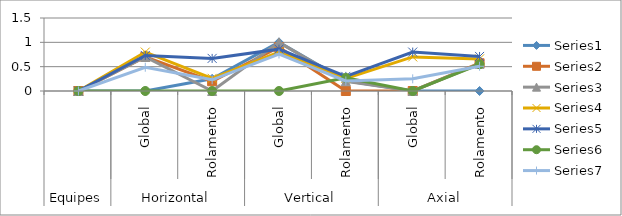
| Category | Series 0 | Series 1 | Series 2 | Series 3 | Series 4 | Series 5 | Series 6 |
|---|---|---|---|---|---|---|---|
| 0 | 0 | 0 | 0 | 0 | 0 | 0 | 0 |
| 1 | 0 | 0.7 | 0.7 | 0.8 | 0.73 | 0 | 0.488 |
| 2 | 0.25 | 0.2 | 0 | 0.26 | 0.67 | 0 | 0.23 |
| 3 | 1 | 0.9 | 1 | 0.8 | 0.86 | 0 | 0.76 |
| 4 | 0.21 | 0 | 0.2 | 0.26 | 0.3 | 0.27 | 0.207 |
| 5 | 0 | 0 | 0 | 0.7 | 0.8 | 0 | 0.25 |
| 6 | 0 | 0.57 | 0.56 | 0.66 | 0.71 | 0.55 | 0.508 |